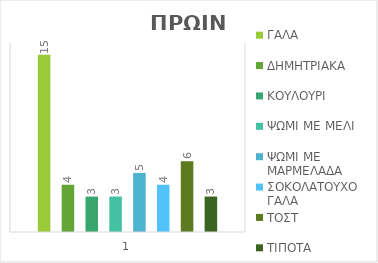
| Category | ΓΑΛΑ | ΔΗΜΗΤΡΙΑΚΑ | ΚΟΥΛΟΥΡΙ | ΨΩΜΙ ΜΕ ΜΕΛΙ | ΨΩΜΙ ΜΕ ΜΑΡΜΕΛΑΔΑ | ΣΟΚΟΛΑΤΟΥΧΟ ΓΑΛΑ | ΤΟΣΤ | ΤΙΠΟΤΑ |
|---|---|---|---|---|---|---|---|---|
| 0 | 15 | 4 | 3 | 3 | 5 | 4 | 6 | 3 |